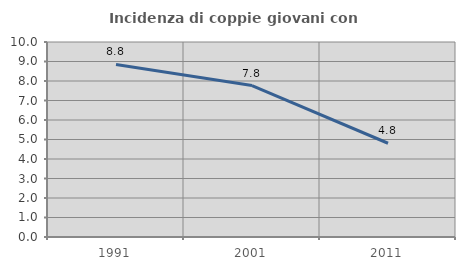
| Category | Incidenza di coppie giovani con figli |
|---|---|
| 1991.0 | 8.85 |
| 2001.0 | 7.767 |
| 2011.0 | 4.808 |